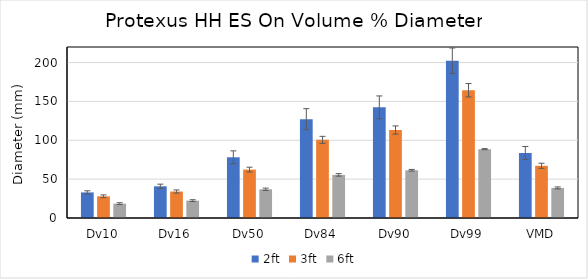
| Category | 2ft | 3ft | 6ft |
|---|---|---|---|
| Dv10 | 32.914 | 27.9 | 18.433 |
| Dv16 | 40.762 | 34.07 | 22.378 |
| Dv50 | 78.112 | 62.272 | 36.932 |
| Dv84 | 127.182 | 100.546 | 55.459 |
| Dv90 | 142.412 | 113.226 | 61.402 |
| Dv99 | 202.28 | 164.378 | 88.547 |
| VMD | 83.724 | 67.156 | 38.718 |